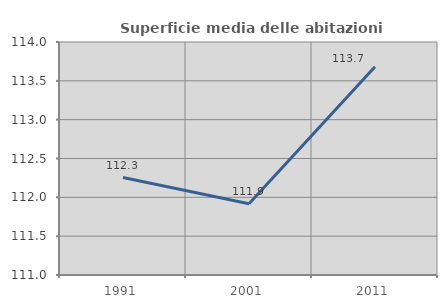
| Category | Superficie media delle abitazioni occupate |
|---|---|
| 1991.0 | 112.254 |
| 2001.0 | 111.918 |
| 2011.0 | 113.681 |